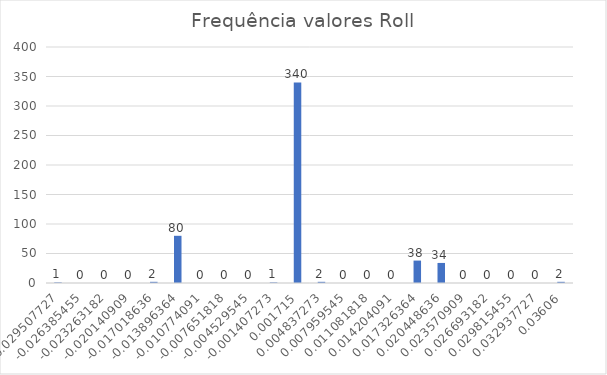
| Category | Series 0 |
|---|---|
| -0.029507727272727272 | 1 |
| -0.026385454545454545 | 0 |
| -0.023263181818181815 | 0 |
| -0.02014090909090909 | 0 |
| -0.01701863636363636 | 2 |
| -0.013896363636363634 | 80 |
| -0.010774090909090907 | 0 |
| -0.00765181818181818 | 0 |
| -0.004529545454545453 | 0 |
| -0.0014072727272727258 | 1 |
| 0.0017150000000000012 | 340 |
| 0.004837272727272732 | 2 |
| 0.007959545454545455 | 0 |
| 0.011081818181818186 | 0 |
| 0.01420409090909091 | 0 |
| 0.01732636363636364 | 38 |
| 0.02044863636363637 | 34 |
| 0.023570909090909094 | 0 |
| 0.026693181818181824 | 0 |
| 0.029815454545454548 | 0 |
| 0.03293772727272728 | 0 |
| 0.03606 | 2 |